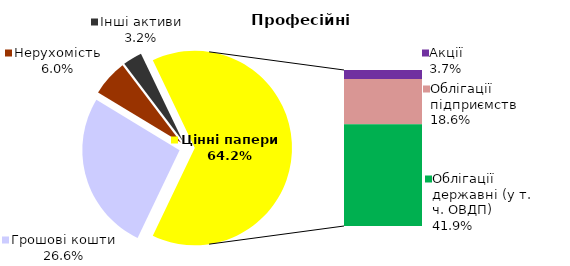
| Category | Професійні |
|---|---|
| Грошові кошти | 31.175 |
| Банківські метали | 0 |
| Нерухомість | 7.062 |
| Інші активи | 3.764 |
| Акції | 4.36 |
| Облігації підприємств | 21.875 |
| Муніципальні облігації | 0 |
| Облігації державні (у т. ч. ОВДП) | 49.129 |